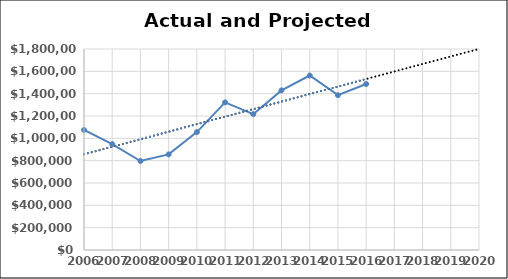
| Category | Series 0 |
|---|---|
| 2006.0 | 1075050 |
| 2007.0 | 948500 |
| 2008.0 | 796845 |
| 2009.0 | 856210 |
| 2010.0 | 1055600 |
| 2011.0 | 1321800 |
| 2012.0 | 1216500 |
| 2013.0 | 1429500 |
| 2014.0 | 1562540 |
| 2015.0 | 1386540 |
| 2016.0 | 1486550 |